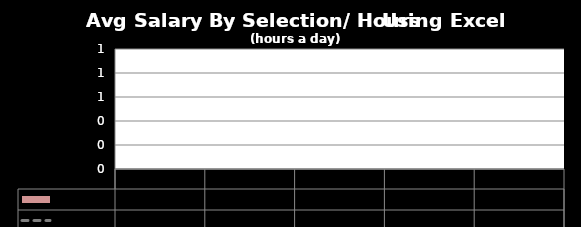
| Category | Selection |
|---|---|
| 0 | 0 |
| 1 or 2 | 0 |
| 2 to 3 | 0 |
| 4 to 6 | 0 |
| 7 to 8 | 0 |